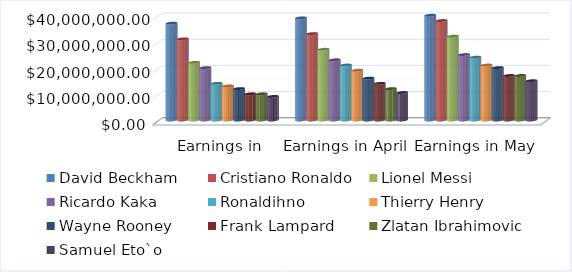
| Category | David Beckham | Cristiano Ronaldo | Lionel Messi | Ricardo Kaka | Ronaldihno | Thierry Henry | Wayne Rooney | Frank Lampard | Zlatan Ibrahimovic | Samuel Eto`o |
|---|---|---|---|---|---|---|---|---|---|---|
| Earnings in March | 37000000 | 31000000 | 22000000 | 20000000 | 14000000 | 13000000 | 12000000 | 10000000 | 10000000 | 9000000 |
| Earnings in April | 39000000 | 33000000 | 27000000 | 23000000 | 21000000 | 19000000 | 16000000 | 14000000 | 12000000 | 10500000 |
| Earnings in May | 40000000 | 38000000 | 32000000 | 25000000 | 24000000 | 21000000 | 20000000 | 17000000 | 17000000 | 15000000 |